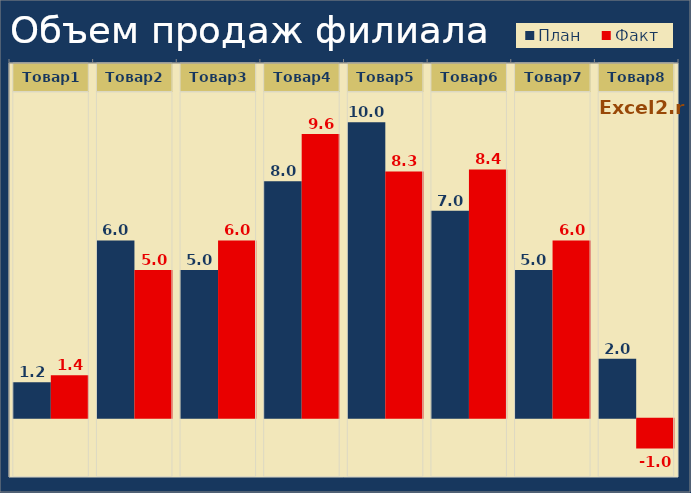
| Category | План | Факт |
|---|---|---|
| Товар1 | 1.2 | 1.44 |
| Товар2 | 6 | 5 |
| Товар3 | 5 | 6 |
| Товар4 | 8 | 9.6 |
| Товар5 | 10 | 8.333 |
| Товар6 | 7 | 8.4 |
| Товар7 | 5 | 6 |
| Товар8 | 2 | -1 |